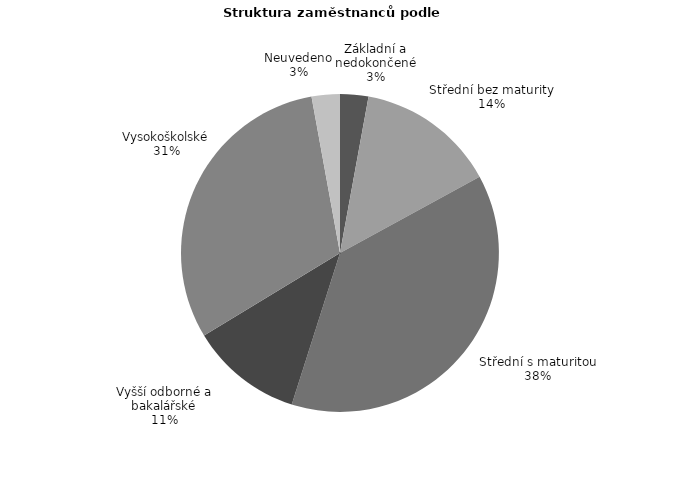
| Category | Series 0 |
|---|---|
| Základní a nedokončené | 18.625 |
| Střední bez maturity | 91.728 |
| Střední s maturitou | 244.985 |
| Vyšší odborné a bakalářské | 73.855 |
| Vysokoškolské | 199.389 |
| Neuvedeno | 18.578 |